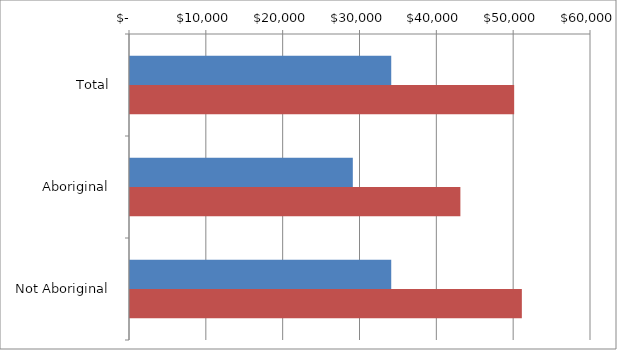
| Category | Series 0 | Series 1 |
|---|---|---|
| Total | 34000 | 50000 |
|  Aboriginal  | 29000 | 43000 |
|  Not Aboriginal  | 34000 | 51000 |